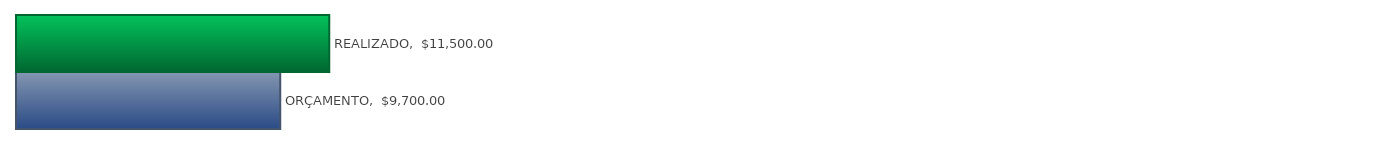
| Category | Series 0 |
|---|---|
| ORÇAMENTO | 9700 |
| REALIZADO | 11500 |